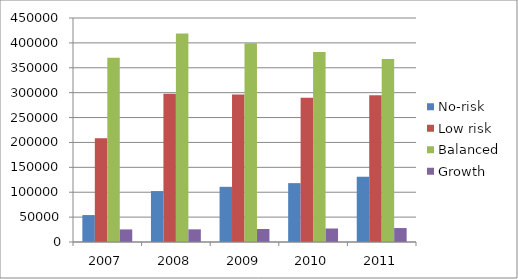
| Category | No-risk | Low risk | Balanced | Growth |
|---|---|---|---|---|
| 2007.0 | 54115 | 208177 | 370251 | 25282 |
| 2008.0 | 102327 | 298074 | 419104 | 25410 |
| 2009.0 | 110876 | 296388 | 399422 | 26144 |
| 2010.0 | 118255 | 289828 | 381707 | 27120 |
| 2011.0 | 131273 | 294620 | 367526 | 28049 |